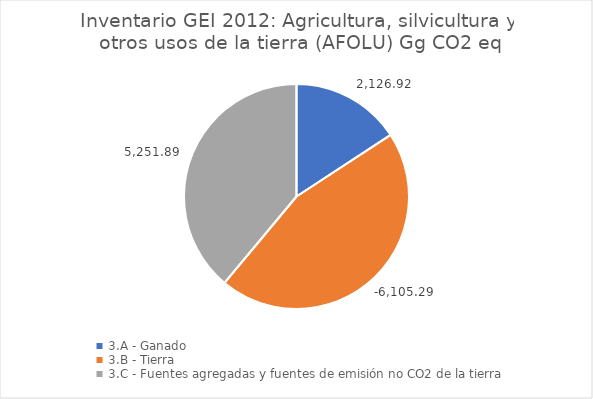
| Category | Series 0 |
|---|---|
| 3.A - Ganado | 2126.92 |
| 3.B - Tierra | -6105.29 |
| 3.C - Fuentes agregadas y fuentes de emisión no CO2 de la tierra | 5251.89 |